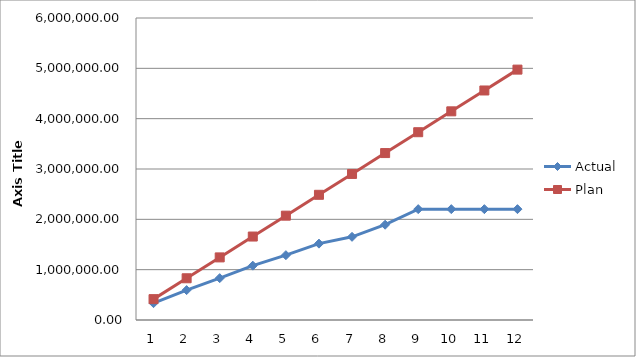
| Category | Actual | Plan |
|---|---|---|
| 0 | 334506.38 | 414550.917 |
| 1 | 593836.72 | 829101.833 |
| 2 | 831607.56 | 1243652.75 |
| 3 | 1079569.38 | 1658203.667 |
| 4 | 1288046.5 | 2072754.583 |
| 5 | 1517223.85 | 2487305.5 |
| 6 | 1652425.78 | 2901856.417 |
| 7 | 1893142.58 | 3316407.333 |
| 8 | 2202429.05 | 3730958.25 |
| 9 | 2202429.05 | 4145509.167 |
| 10 | 2202429.05 | 4560060.083 |
| 11 | 2202429.05 | 4974611 |